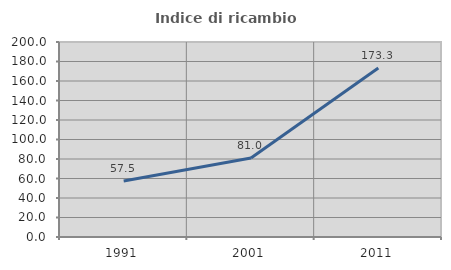
| Category | Indice di ricambio occupazionale  |
|---|---|
| 1991.0 | 57.534 |
| 2001.0 | 80.952 |
| 2011.0 | 173.333 |